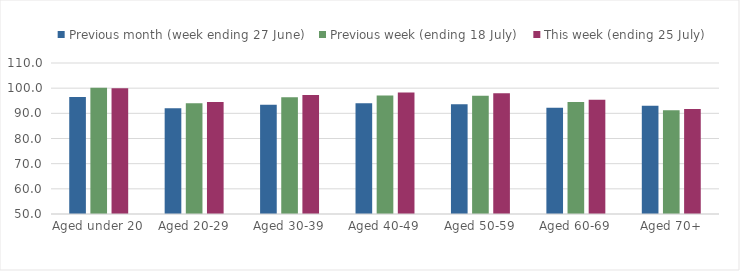
| Category | Previous month (week ending 27 June) | Previous week (ending 18 July) | This week (ending 25 July) |
|---|---|---|---|
| Aged under 20 | 96.507 | 100.15 | 99.955 |
| Aged 20-29 | 91.97 | 94.016 | 94.491 |
| Aged 30-39 | 93.374 | 96.39 | 97.249 |
| Aged 40-49 | 94.019 | 97.079 | 98.263 |
| Aged 50-59 | 93.654 | 96.981 | 98.017 |
| Aged 60-69 | 92.226 | 94.5 | 95.394 |
| Aged 70+ | 93.004 | 91.179 | 91.673 |